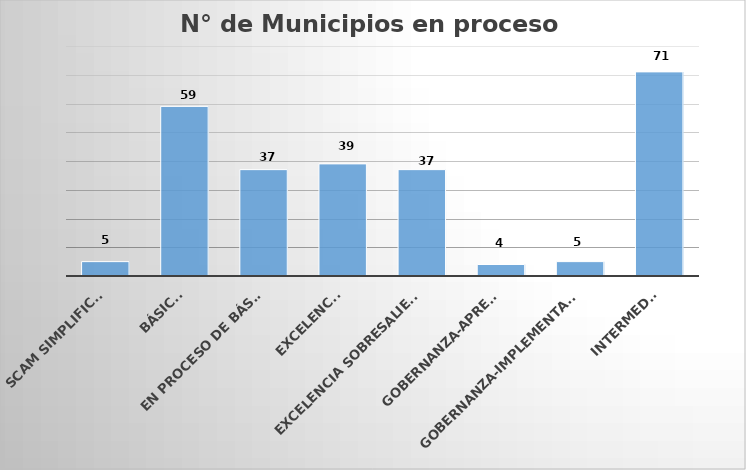
| Category | N° de Municipios Certificados  |
|---|---|
| SCAM SIMPLIFICADO | 5 |
| Básica | 59 |
| En proceso de Básica | 37 |
| Excelencia | 39 |
| Excelencia Sobresaliente | 37 |
| Gobernanza-apresto | 4 |
| Gobernanza-Implementación | 5 |
| Intermedia | 71 |